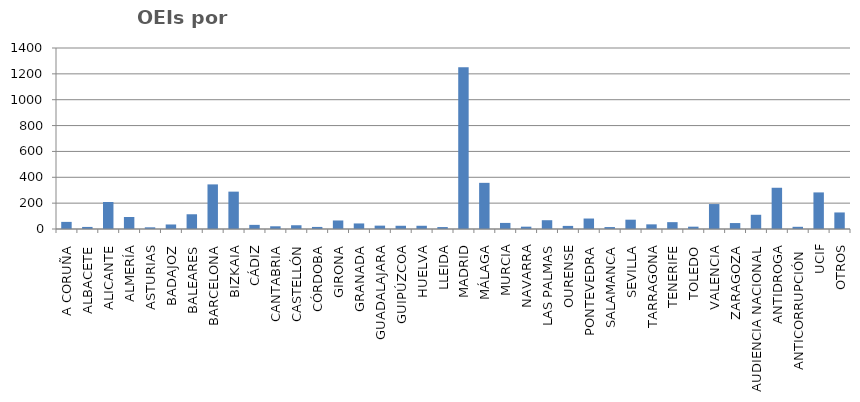
| Category | Series 0 |
|---|---|
| A CORUÑA | 55 |
| ALBACETE | 16 |
| ALICANTE | 209 |
| ALMERÍA | 93 |
| ASTURIAS | 13 |
| BADAJOZ | 35 |
| BALEARES | 114 |
| BARCELONA | 345 |
| BIZKAIA | 289 |
| CÁDIZ | 32 |
| CANTABRIA | 21 |
| CASTELLÓN | 29 |
| CÓRDOBA | 16 |
| GIRONA | 66 |
| GRANADA | 43 |
| GUADALAJARA | 26 |
| GUIPÚZCOA | 25 |
| HUELVA | 25 |
| LLEIDA | 15 |
| MADRID | 1252 |
| MÁLAGA | 357 |
| MURCIA | 47 |
| NAVARRA | 18 |
| LAS PALMAS | 68 |
| OURENSE | 24 |
| PONTEVEDRA | 81 |
| SALAMANCA | 15 |
| SEVILLA | 72 |
| TARRAGONA | 36 |
| TENERIFE | 53 |
| TOLEDO | 18 |
| VALENCIA | 193 |
| ZARAGOZA | 46 |
| AUDIENCIA NACIONAL | 110 |
| ANTIDROGA | 319 |
| ANTICORRUPCIÓN  | 17 |
| UCIF | 283 |
| OTROS | 128 |